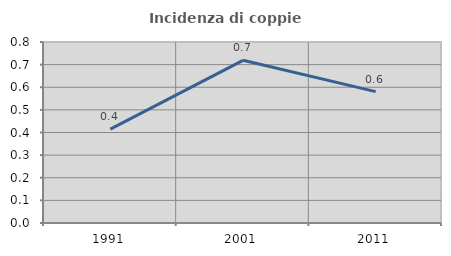
| Category | Incidenza di coppie miste |
|---|---|
| 1991.0 | 0.415 |
| 2001.0 | 0.719 |
| 2011.0 | 0.581 |